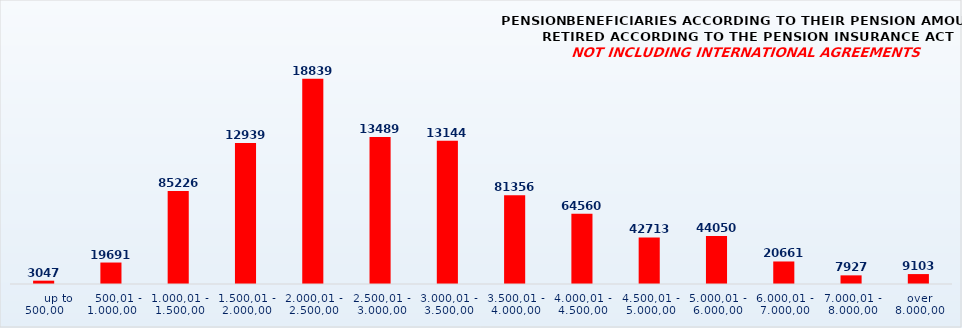
| Category | PENSION BENEFICIARIES ACCORDING TO TYPES AND AMOUNTS OF PENSION, RETIRED ACCORDING TO THE PENSION INSURANCE ACT
NOT INCLUDING INTERNATIONAL AGREEMENTS |
|---|---|
|       up to 500,00 | 3047 |
|    500,01 - 1.000,00 | 19691 |
| 1.000,01 - 1.500,00 | 85226 |
| 1.500,01 - 2.000,00 | 129397 |
| 2.000,01 - 2.500,00 | 188398 |
| 2.500,01 - 3.000,00 | 134894 |
| 3.000,01 - 3.500,00 | 131440 |
| 3.500,01 - 4.000,00 | 81356 |
| 4.000,01 - 4.500,00 | 64560 |
| 4.500,01 - 5.000,00 | 42713 |
| 5.000,01 - 6.000,00 | 44050 |
| 6.000,01 - 7.000,00 | 20661 |
| 7.000,01 - 8.000,00 | 7927 |
|  over  8.000,00 | 9103 |